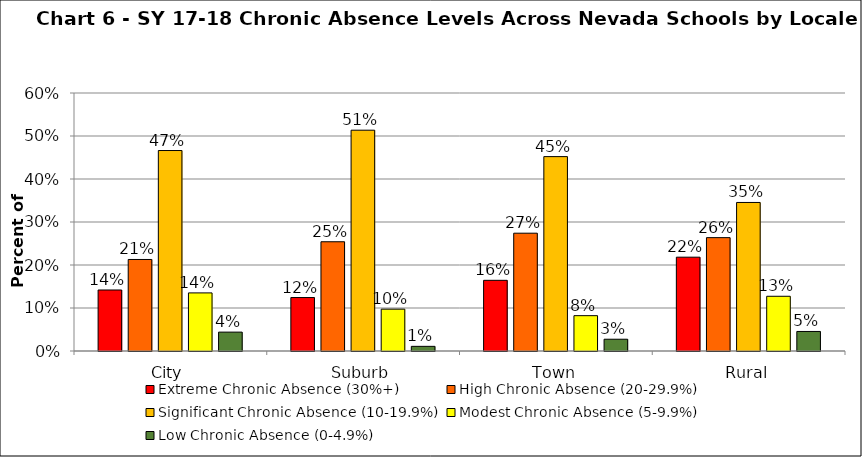
| Category | Extreme Chronic Absence (30%+) | High Chronic Absence (20-29.9%) | Significant Chronic Absence (10-19.9%) | Modest Chronic Absence (5-9.9%) | Low Chronic Absence (0-4.9%) |
|---|---|---|---|---|---|
| 0 | 0.142 | 0.213 | 0.466 | 0.135 | 0.044 |
| 1 | 0.124 | 0.254 | 0.514 | 0.097 | 0.011 |
| 2 | 0.164 | 0.274 | 0.452 | 0.082 | 0.027 |
| 3 | 0.218 | 0.264 | 0.345 | 0.127 | 0.045 |